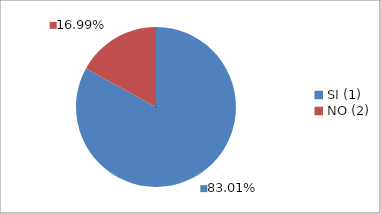
| Category | Series 0 |
|---|---|
| SI (1) | 0.83 |
| NO (2) | 0.17 |